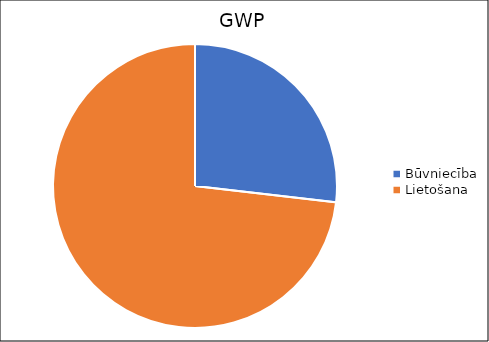
| Category | Būvniecība |
|---|---|
| Būvniecība | 5.5 |
| Lietošana | 15 |